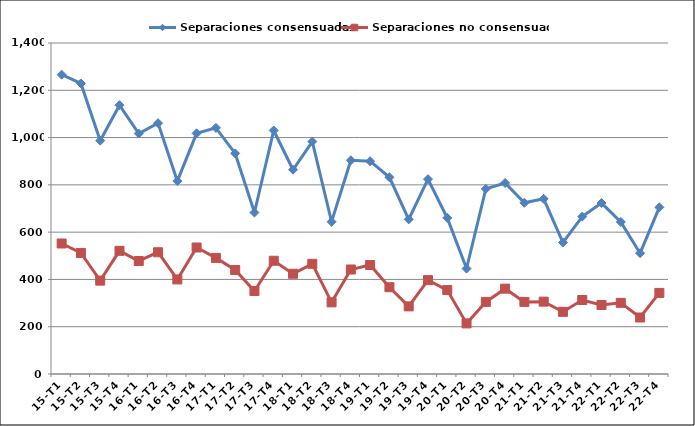
| Category | Separaciones consensuadas | Separaciones no consensuadas |
|---|---|---|
| 15-T1 | 1266 | 552 |
| 15-T2 | 1229 | 512 |
| 15-T3 | 987 | 395 |
| 15-T4 | 1137 | 521 |
| 16-T1 | 1017 | 478 |
| 16-T2 | 1061 | 515 |
| 16-T3 | 816 | 400 |
| 16-T4 | 1018 | 535 |
| 17-T1 | 1041 | 491 |
| 17-T2 | 933 | 440 |
| 17-T3 | 683 | 351 |
| 17-T4 | 1030 | 479 |
| 18-T1 | 864 | 424 |
| 18-T2 | 983 | 466 |
| 18-T3 | 644 | 303 |
| 18-T4 | 904 | 442 |
| 19-T1 | 900 | 461 |
| 19-T2 | 832 | 367 |
| 19-T3 | 654 | 286 |
| 19-T4 | 824 | 397 |
| 20-T1 | 660 | 355 |
| 20-T2 | 446 | 214 |
| 20-T3 | 783 | 305 |
| 20-T4 | 808 | 361 |
| 21-T1 | 724 | 305 |
| 21-T2 | 741 | 306 |
| 21-T3 | 556 | 263 |
| 21-T4 | 666 | 313 |
| 22-T1 | 723 | 292 |
| 22-T2 | 643 | 301 |
| 22-T3 | 511 | 239 |
| 22-T4 | 705 | 343 |